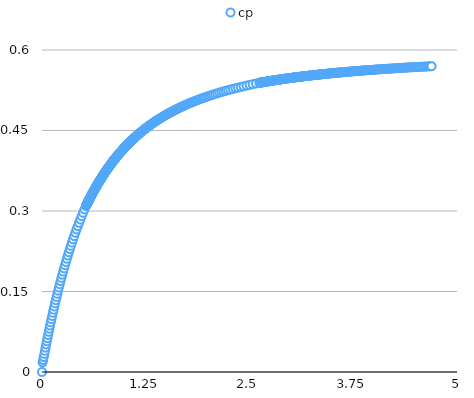
| Category | cp |
|---|---|
| 0.0 | 0 |
| 0.006966 | 0.018 |
| 0.014007 | 0.022 |
| 0.021127 | 0.028 |
| 0.028327 | 0.034 |
| 0.03561 | 0.039 |
| 0.042979 | 0.045 |
| 0.050435 | 0.051 |
| 0.057983 | 0.057 |
| 0.065623 | 0.063 |
| 0.073361 | 0.069 |
| 0.081198 | 0.075 |
| 0.089138 | 0.081 |
| 0.097184 | 0.087 |
| 0.10534 | 0.092 |
| 0.11361 | 0.098 |
| 0.121998 | 0.104 |
| 0.130507 | 0.11 |
| 0.139143 | 0.116 |
| 0.147909 | 0.122 |
| 0.15681 | 0.128 |
| 0.165853 | 0.134 |
| 0.175041 | 0.14 |
| 0.184381 | 0.146 |
| 0.193878 | 0.152 |
| 0.20354 | 0.157 |
| 0.213372 | 0.163 |
| 0.223383 | 0.169 |
| 0.233578 | 0.175 |
| 0.243967 | 0.181 |
| 0.254558 | 0.187 |
| 0.265361 | 0.193 |
| 0.276383 | 0.199 |
| 0.287637 | 0.205 |
| 0.299133 | 0.211 |
| 0.310883 | 0.217 |
| 0.3229 | 0.223 |
| 0.335196 | 0.229 |
| 0.347788 | 0.235 |
| 0.36069 | 0.241 |
| 0.373919 | 0.247 |
| 0.387494 | 0.253 |
| 0.401435 | 0.259 |
| 0.415763 | 0.265 |
| 0.430501 | 0.272 |
| 0.445675 | 0.278 |
| 0.461312 | 0.284 |
| 0.477444 | 0.29 |
| 0.494102 | 0.297 |
| 0.511324 | 0.303 |
| 0.52915 | 0.309 |
| 0.530968 | 0.31 |
| 0.532792 | 0.31 |
| 0.534622 | 0.311 |
| 0.53646 | 0.312 |
| 0.538303 | 0.312 |
| 0.540154 | 0.313 |
| 0.542011 | 0.313 |
| 0.543876 | 0.314 |
| 0.545747 | 0.314 |
| 0.547625 | 0.315 |
| 0.549509 | 0.316 |
| 0.551401 | 0.316 |
| 0.5533 | 0.317 |
| 0.555207 | 0.317 |
| 0.55712 | 0.318 |
| 0.559041 | 0.319 |
| 0.560968 | 0.319 |
| 0.562904 | 0.32 |
| 0.564846 | 0.32 |
| 0.566796 | 0.321 |
| 0.568754 | 0.321 |
| 0.570719 | 0.322 |
| 0.572692 | 0.323 |
| 0.574673 | 0.323 |
| 0.576661 | 0.324 |
| 0.578657 | 0.324 |
| 0.580661 | 0.325 |
| 0.582673 | 0.326 |
| 0.584693 | 0.326 |
| 0.586721 | 0.327 |
| 0.588757 | 0.327 |
| 0.590801 | 0.328 |
| 0.592854 | 0.329 |
| 0.594915 | 0.329 |
| 0.596984 | 0.33 |
| 0.599062 | 0.33 |
| 0.601148 | 0.331 |
| 0.603243 | 0.332 |
| 0.605347 | 0.332 |
| 0.607459 | 0.333 |
| 0.60958 | 0.333 |
| 0.61171 | 0.334 |
| 0.613849 | 0.335 |
| 0.615997 | 0.335 |
| 0.618154 | 0.336 |
| 0.620321 | 0.336 |
| 0.622496 | 0.337 |
| 0.624681 | 0.338 |
| 0.626876 | 0.338 |
| 0.62908 | 0.339 |
| 0.631293 | 0.34 |
| 0.633516 | 0.34 |
| 0.635749 | 0.341 |
| 0.637992 | 0.341 |
| 0.640245 | 0.342 |
| 0.642507 | 0.343 |
| 0.64478 | 0.343 |
| 0.647063 | 0.344 |
| 0.649356 | 0.344 |
| 0.65166 | 0.345 |
| 0.653974 | 0.346 |
| 0.656298 | 0.346 |
| 0.658633 | 0.347 |
| 0.660979 | 0.348 |
| 0.663336 | 0.348 |
| 0.665704 | 0.349 |
| 0.668083 | 0.349 |
| 0.670473 | 0.35 |
| 0.672874 | 0.351 |
| 0.675286 | 0.351 |
| 0.67771 | 0.352 |
| 0.680146 | 0.353 |
| 0.682593 | 0.353 |
| 0.685052 | 0.354 |
| 0.687522 | 0.354 |
| 0.690005 | 0.355 |
| 0.6925 | 0.356 |
| 0.695007 | 0.356 |
| 0.697526 | 0.357 |
| 0.700058 | 0.358 |
| 0.702603 | 0.358 |
| 0.70516 | 0.359 |
| 0.70773 | 0.36 |
| 0.710313 | 0.36 |
| 0.712909 | 0.361 |
| 0.715518 | 0.361 |
| 0.71814 | 0.362 |
| 0.720776 | 0.363 |
| 0.723425 | 0.363 |
| 0.726089 | 0.364 |
| 0.728766 | 0.365 |
| 0.731457 | 0.365 |
| 0.734162 | 0.366 |
| 0.736881 | 0.367 |
| 0.739615 | 0.367 |
| 0.742364 | 0.368 |
| 0.745127 | 0.369 |
| 0.747905 | 0.369 |
| 0.750698 | 0.37 |
| 0.753506 | 0.371 |
| 0.75633 | 0.371 |
| 0.759169 | 0.372 |
| 0.762024 | 0.373 |
| 0.764894 | 0.373 |
| 0.767781 | 0.374 |
| 0.770684 | 0.375 |
| 0.773603 | 0.375 |
| 0.776538 | 0.376 |
| 0.779491 | 0.376 |
| 0.78246 | 0.377 |
| 0.785446 | 0.378 |
| 0.78845 | 0.378 |
| 0.791471 | 0.379 |
| 0.794509 | 0.38 |
| 0.797566 | 0.38 |
| 0.80064 | 0.381 |
| 0.803733 | 0.382 |
| 0.806844 | 0.383 |
| 0.809974 | 0.383 |
| 0.813122 | 0.384 |
| 0.81629 | 0.385 |
| 0.819477 | 0.385 |
| 0.822684 | 0.386 |
| 0.82591 | 0.387 |
| 0.829156 | 0.387 |
| 0.832423 | 0.388 |
| 0.83571 | 0.389 |
| 0.839017 | 0.389 |
| 0.842346 | 0.39 |
| 0.845695 | 0.391 |
| 0.849067 | 0.391 |
| 0.852459 | 0.392 |
| 0.855874 | 0.393 |
| 0.859311 | 0.393 |
| 0.862771 | 0.394 |
| 0.866253 | 0.395 |
| 0.869759 | 0.395 |
| 0.873287 | 0.396 |
| 0.87684 | 0.397 |
| 0.880416 | 0.398 |
| 0.884017 | 0.398 |
| 0.887642 | 0.399 |
| 0.891292 | 0.4 |
| 0.894967 | 0.4 |
| 0.898668 | 0.401 |
| 0.902394 | 0.402 |
| 0.906147 | 0.402 |
| 0.909926 | 0.403 |
| 0.913733 | 0.404 |
| 0.917566 | 0.405 |
| 0.921427 | 0.405 |
| 0.925316 | 0.406 |
| 0.929233 | 0.407 |
| 0.933179 | 0.407 |
| 0.937154 | 0.408 |
| 0.941159 | 0.409 |
| 0.945194 | 0.41 |
| 0.949259 | 0.41 |
| 0.953354 | 0.411 |
| 0.957481 | 0.412 |
| 0.96164 | 0.413 |
| 0.965831 | 0.413 |
| 0.970054 | 0.414 |
| 0.97431 | 0.415 |
| 0.9786 | 0.415 |
| 0.982924 | 0.416 |
| 0.987282 | 0.417 |
| 0.991675 | 0.418 |
| 0.996104 | 0.418 |
| 1.000569 | 0.419 |
| 1.005071 | 0.42 |
| 1.009609 | 0.421 |
| 1.014186 | 0.421 |
| 1.0188 | 0.422 |
| 1.023454 | 0.423 |
| 1.028147 | 0.424 |
| 1.03288 | 0.424 |
| 1.037654 | 0.425 |
| 1.042469 | 0.426 |
| 1.047327 | 0.427 |
| 1.052227 | 0.427 |
| 1.05717 | 0.428 |
| 1.062158 | 0.429 |
| 1.06719 | 0.43 |
| 1.072268 | 0.43 |
| 1.077393 | 0.431 |
| 1.082564 | 0.432 |
| 1.087784 | 0.433 |
| 1.093052 | 0.433 |
| 1.098369 | 0.434 |
| 1.103737 | 0.435 |
| 1.109157 | 0.436 |
| 1.114628 | 0.437 |
| 1.120153 | 0.437 |
| 1.125731 | 0.438 |
| 1.131365 | 0.439 |
| 1.137055 | 0.44 |
| 1.142801 | 0.44 |
| 1.148606 | 0.441 |
| 1.15447 | 0.442 |
| 1.160393 | 0.443 |
| 1.166379 | 0.444 |
| 1.172426 | 0.444 |
| 1.178538 | 0.445 |
| 1.184714 | 0.446 |
| 1.190956 | 0.447 |
| 1.197266 | 0.448 |
| 1.203644 | 0.448 |
| 1.210093 | 0.449 |
| 1.216613 | 0.45 |
| 1.223206 | 0.451 |
| 1.229873 | 0.452 |
| 1.236616 | 0.452 |
| 1.243437 | 0.453 |
| 1.250336 | 0.454 |
| 1.257316 | 0.455 |
| 1.264379 | 0.456 |
| 1.271526 | 0.457 |
| 1.278759 | 0.457 |
| 1.28608 | 0.458 |
| 1.29349 | 0.459 |
| 1.300992 | 0.46 |
| 1.308588 | 0.461 |
| 1.31628 | 0.462 |
| 1.32407 | 0.462 |
| 1.33196 | 0.463 |
| 1.339953 | 0.464 |
| 1.348051 | 0.465 |
| 1.356256 | 0.466 |
| 1.364572 | 0.467 |
| 1.373 | 0.468 |
| 1.381543 | 0.469 |
| 1.390205 | 0.469 |
| 1.398988 | 0.47 |
| 1.407895 | 0.471 |
| 1.416929 | 0.472 |
| 1.426094 | 0.473 |
| 1.435393 | 0.474 |
| 1.44483 | 0.475 |
| 1.454407 | 0.476 |
| 1.46413 | 0.476 |
| 1.474001 | 0.477 |
| 1.484025 | 0.478 |
| 1.494206 | 0.479 |
| 1.504548 | 0.48 |
| 1.515056 | 0.481 |
| 1.525735 | 0.482 |
| 1.536589 | 0.483 |
| 1.547625 | 0.484 |
| 1.558846 | 0.485 |
| 1.570259 | 0.486 |
| 1.581869 | 0.487 |
| 1.593682 | 0.488 |
| 1.605706 | 0.488 |
| 1.617946 | 0.489 |
| 1.630409 | 0.49 |
| 1.643103 | 0.491 |
| 1.656034 | 0.492 |
| 1.669212 | 0.493 |
| 1.682644 | 0.494 |
| 1.696338 | 0.495 |
| 1.710305 | 0.496 |
| 1.724553 | 0.497 |
| 1.739093 | 0.498 |
| 1.753934 | 0.499 |
| 1.769089 | 0.5 |
| 1.784568 | 0.501 |
| 1.800384 | 0.502 |
| 1.81655 | 0.503 |
| 1.83308 | 0.504 |
| 1.849988 | 0.505 |
| 1.867288 | 0.506 |
| 1.884998 | 0.507 |
| 1.903134 | 0.508 |
| 1.921714 | 0.51 |
| 1.940758 | 0.511 |
| 1.960285 | 0.512 |
| 1.980317 | 0.513 |
| 2.000878 | 0.514 |
| 2.021991 | 0.515 |
| 2.043683 | 0.516 |
| 2.065981 | 0.517 |
| 2.088916 | 0.518 |
| 2.112519 | 0.519 |
| 2.136824 | 0.521 |
| 2.161867 | 0.522 |
| 2.187689 | 0.523 |
| 2.214332 | 0.524 |
| 2.241841 | 0.525 |
| 2.270266 | 0.526 |
| 2.299659 | 0.528 |
| 2.33008 | 0.529 |
| 2.361591 | 0.53 |
| 2.39426 | 0.531 |
| 2.428162 | 0.532 |
| 2.463378 | 0.534 |
| 2.499998 | 0.535 |
| 2.53812 | 0.536 |
| 2.577852 | 0.538 |
| 2.619313 | 0.539 |
| 2.623559 | 0.539 |
| 2.627824 | 0.539 |
| 2.632108 | 0.539 |
| 2.636411 | 0.539 |
| 2.640732 | 0.539 |
| 2.645074 | 0.54 |
| 2.649434 | 0.54 |
| 2.653815 | 0.54 |
| 2.658215 | 0.54 |
| 2.662635 | 0.54 |
| 2.667075 | 0.54 |
| 2.671535 | 0.54 |
| 2.676016 | 0.54 |
| 2.680517 | 0.54 |
| 2.685039 | 0.541 |
| 2.689582 | 0.541 |
| 2.694146 | 0.541 |
| 2.698731 | 0.541 |
| 2.703337 | 0.541 |
| 2.707965 | 0.541 |
| 2.712614 | 0.541 |
| 2.717286 | 0.541 |
| 2.721979 | 0.542 |
| 2.726695 | 0.542 |
| 2.731433 | 0.542 |
| 2.736193 | 0.542 |
| 2.740977 | 0.542 |
| 2.745783 | 0.542 |
| 2.750613 | 0.542 |
| 2.755466 | 0.542 |
| 2.760342 | 0.543 |
| 2.765242 | 0.543 |
| 2.770166 | 0.543 |
| 2.775114 | 0.543 |
| 2.780086 | 0.543 |
| 2.785083 | 0.543 |
| 2.790105 | 0.543 |
| 2.795151 | 0.543 |
| 2.800223 | 0.543 |
| 2.80532 | 0.544 |
| 2.810443 | 0.544 |
| 2.815591 | 0.544 |
| 2.820765 | 0.544 |
| 2.825966 | 0.544 |
| 2.831193 | 0.544 |
| 2.836447 | 0.544 |
| 2.841728 | 0.544 |
| 2.847035 | 0.545 |
| 2.852371 | 0.545 |
| 2.857733 | 0.545 |
| 2.863124 | 0.545 |
| 2.868543 | 0.545 |
| 2.87399 | 0.545 |
| 2.879466 | 0.545 |
| 2.88497 | 0.545 |
| 2.890504 | 0.546 |
| 2.896067 | 0.546 |
| 2.90166 | 0.546 |
| 2.907283 | 0.546 |
| 2.912936 | 0.546 |
| 2.91862 | 0.546 |
| 2.924334 | 0.546 |
| 2.930079 | 0.546 |
| 2.935856 | 0.547 |
| 2.941664 | 0.547 |
| 2.947504 | 0.547 |
| 2.953376 | 0.547 |
| 2.959281 | 0.547 |
| 2.965219 | 0.547 |
| 2.97119 | 0.547 |
| 2.977194 | 0.548 |
| 2.983232 | 0.548 |
| 2.989304 | 0.548 |
| 2.995411 | 0.548 |
| 3.001552 | 0.548 |
| 3.007728 | 0.548 |
| 3.01394 | 0.548 |
| 3.020188 | 0.548 |
| 3.026471 | 0.549 |
| 3.032791 | 0.549 |
| 3.039148 | 0.549 |
| 3.045542 | 0.549 |
| 3.051974 | 0.549 |
| 3.058444 | 0.549 |
| 3.064952 | 0.549 |
| 3.071498 | 0.549 |
| 3.078084 | 0.55 |
| 3.084709 | 0.55 |
| 3.091374 | 0.55 |
| 3.09808 | 0.55 |
| 3.104826 | 0.55 |
| 3.111613 | 0.55 |
| 3.118442 | 0.55 |
| 3.125313 | 0.55 |
| 3.132226 | 0.551 |
| 3.139182 | 0.551 |
| 3.146182 | 0.551 |
| 3.153225 | 0.551 |
| 3.160313 | 0.551 |
| 3.167445 | 0.551 |
| 3.174622 | 0.551 |
| 3.181845 | 0.552 |
| 3.189115 | 0.552 |
| 3.196431 | 0.552 |
| 3.203794 | 0.552 |
| 3.211205 | 0.552 |
| 3.218664 | 0.552 |
| 3.226172 | 0.552 |
| 3.233729 | 0.552 |
| 3.241336 | 0.553 |
| 3.248993 | 0.553 |
| 3.256702 | 0.553 |
| 3.264462 | 0.553 |
| 3.272274 | 0.553 |
| 3.280139 | 0.553 |
| 3.288057 | 0.553 |
| 3.296029 | 0.554 |
| 3.304056 | 0.554 |
| 3.312138 | 0.554 |
| 3.320276 | 0.554 |
| 3.32847 | 0.554 |
| 3.336722 | 0.554 |
| 3.345031 | 0.554 |
| 3.353399 | 0.555 |
| 3.361826 | 0.555 |
| 3.370313 | 0.555 |
| 3.378861 | 0.555 |
| 3.38747 | 0.555 |
| 3.396142 | 0.555 |
| 3.404876 | 0.555 |
| 3.413674 | 0.556 |
| 3.422536 | 0.556 |
| 3.431464 | 0.556 |
| 3.440458 | 0.556 |
| 3.449519 | 0.556 |
| 3.458647 | 0.556 |
| 3.467844 | 0.556 |
| 3.477111 | 0.556 |
| 3.486448 | 0.557 |
| 3.495856 | 0.557 |
| 3.505337 | 0.557 |
| 3.514891 | 0.557 |
| 3.524519 | 0.557 |
| 3.534222 | 0.557 |
| 3.544001 | 0.557 |
| 3.553857 | 0.558 |
| 3.563791 | 0.558 |
| 3.573805 | 0.558 |
| 3.583898 | 0.558 |
| 3.594074 | 0.558 |
| 3.604331 | 0.558 |
| 3.614672 | 0.558 |
| 3.625098 | 0.559 |
| 3.63561 | 0.559 |
| 3.646209 | 0.559 |
| 3.656896 | 0.559 |
| 3.667673 | 0.559 |
| 3.67854 | 0.559 |
| 3.6895 | 0.56 |
| 3.700554 | 0.56 |
| 3.711702 | 0.56 |
| 3.722946 | 0.56 |
| 3.734288 | 0.56 |
| 3.745729 | 0.56 |
| 3.757271 | 0.56 |
| 3.768914 | 0.561 |
| 3.780661 | 0.561 |
| 3.792513 | 0.561 |
| 3.804472 | 0.561 |
| 3.816539 | 0.561 |
| 3.828716 | 0.561 |
| 3.841005 | 0.561 |
| 3.853407 | 0.562 |
| 3.865925 | 0.562 |
| 3.878559 | 0.562 |
| 3.891312 | 0.562 |
| 3.904186 | 0.562 |
| 3.917183 | 0.562 |
| 3.930304 | 0.563 |
| 3.943552 | 0.563 |
| 3.956929 | 0.563 |
| 3.970437 | 0.563 |
| 3.984077 | 0.563 |
| 3.997853 | 0.563 |
| 4.011767 | 0.563 |
| 4.02582 | 0.564 |
| 4.040015 | 0.564 |
| 4.054355 | 0.564 |
| 4.068843 | 0.564 |
| 4.08348 | 0.564 |
| 4.098269 | 0.564 |
| 4.113213 | 0.565 |
| 4.128316 | 0.565 |
| 4.143578 | 0.565 |
| 4.159004 | 0.565 |
| 4.174597 | 0.565 |
| 4.190359 | 0.565 |
| 4.206294 | 0.565 |
| 4.222405 | 0.566 |
| 4.238694 | 0.566 |
| 4.255166 | 0.566 |
| 4.271824 | 0.566 |
| 4.288672 | 0.566 |
| 4.305712 | 0.566 |
| 4.32295 | 0.567 |
| 4.340388 | 0.567 |
| 4.358031 | 0.567 |
| 4.375882 | 0.567 |
| 4.393947 | 0.567 |
| 4.412229 | 0.567 |
| 4.430732 | 0.568 |
| 4.449462 | 0.568 |
| 4.468422 | 0.568 |
| 4.487618 | 0.568 |
| 4.507055 | 0.568 |
| 4.526737 | 0.568 |
| 4.546671 | 0.569 |
| 4.566861 | 0.569 |
| 4.587313 | 0.569 |
| 4.608033 | 0.569 |
| 4.629026 | 0.569 |
| 4.6503 | 0.569 |
| 4.671859 | 0.57 |
| 4.693711 | 0.57 |